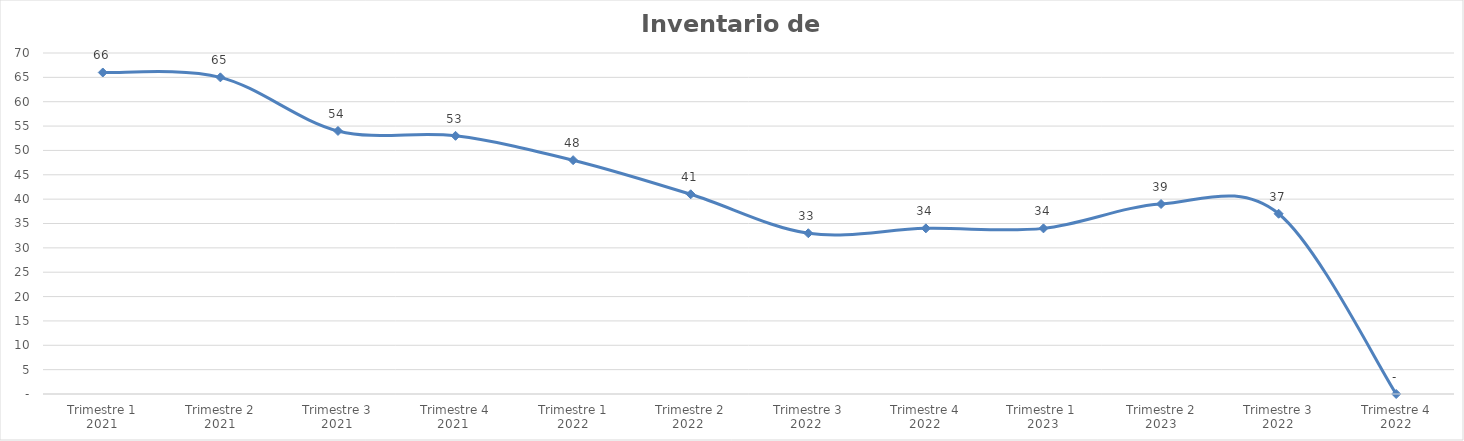
| Category | Series 0 |
|---|---|
| Trimestre 1
2021 | 66 |
| Trimestre 2
2021 | 65 |
| Trimestre 3
2021 | 54 |
| Trimestre 4
2021  | 53 |
| Trimestre 1
2022 | 48 |
| Trimestre 2
2022  | 41 |
| Trimestre 3
2022  | 33 |
| Trimestre 4
2022 | 34 |
| Trimestre 1 
2023 | 34 |
| Trimestre 2
2023 | 39 |
| Trimestre 3
2022 | 37 |
| Trimestre 4
2022 | 0 |